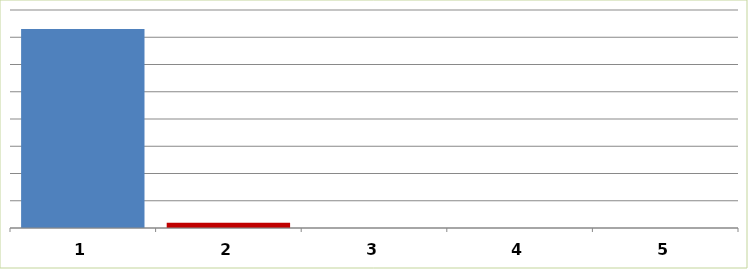
| Category | Series 0 |
|---|---|
| 0 | 1460486 |
| 1 | 38718 |
| 2 | 0 |
| 3 | 0 |
| 4 | 0 |